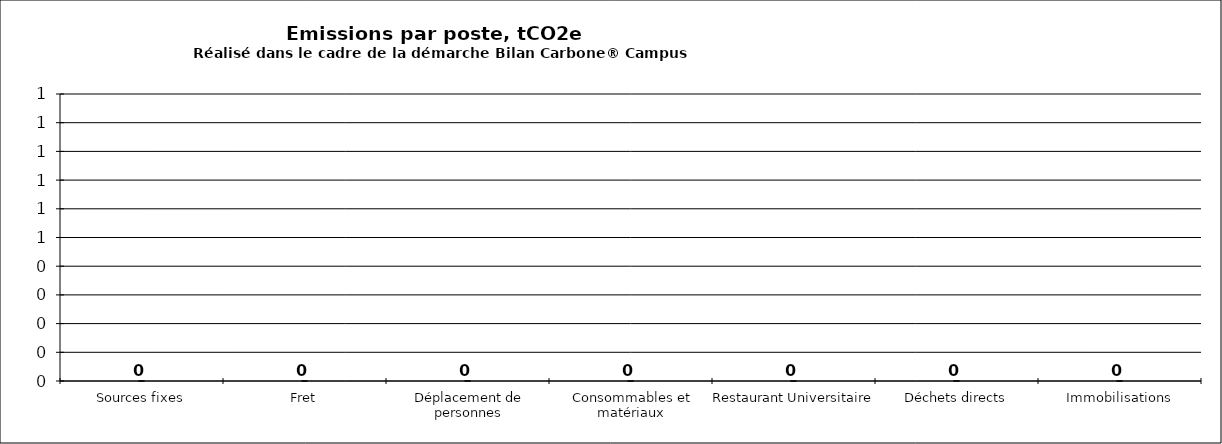
| Category | Series 3 |
|---|---|
| Sources fixes | 0 |
| Fret | 0 |
| Déplacement de personnes | 0 |
| Consommables et matériaux | 0 |
| Restaurant Universitaire | 0 |
| Déchets directs | 0 |
| Immobilisations | 0 |